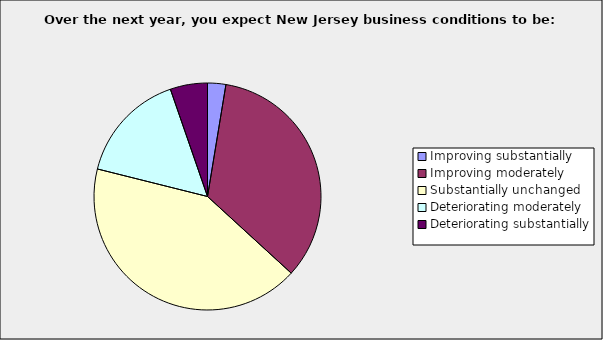
| Category | Series 0 |
|---|---|
| Improving substantially | 0.026 |
| Improving moderately | 0.342 |
| Substantially unchanged | 0.421 |
| Deteriorating moderately | 0.158 |
| Deteriorating substantially | 0.053 |